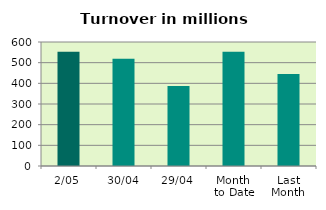
| Category | Series 0 |
|---|---|
| 2/05 | 553.198 |
| 30/04 | 518.68 |
| 29/04 | 387.04 |
| Month 
to Date | 553.198 |
| Last
Month | 444.663 |